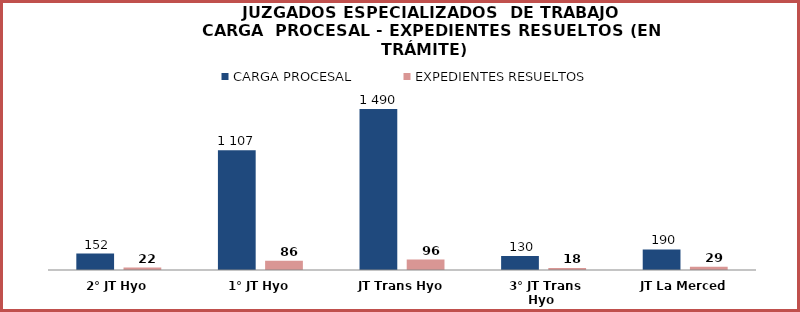
| Category | CARGA PROCESAL | EXPEDIENTES RESUELTOS |
|---|---|---|
| 2° JT Hyo | 152 | 22 |
| 1° JT Hyo | 1107 | 86 |
| JT Trans Hyo | 1490 | 96 |
| 3° JT Trans Hyo | 130 | 18 |
| JT La Merced | 190 | 29 |